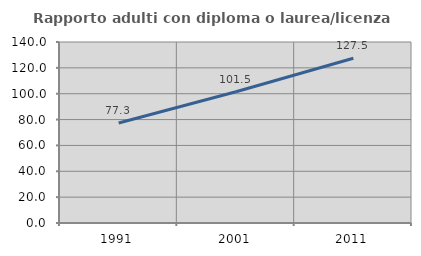
| Category | Rapporto adulti con diploma o laurea/licenza media  |
|---|---|
| 1991.0 | 77.348 |
| 2001.0 | 101.481 |
| 2011.0 | 127.481 |